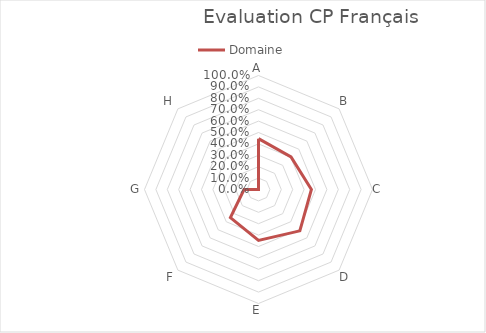
| Category | Domaine |
|---|---|
| A | 0.446 |
| B | 0.403 |
| C | 0.464 |
| D | 0.513 |
| E | 0.447 |
| F | 0.348 |
| G | 0.127 |
| H | 0 |